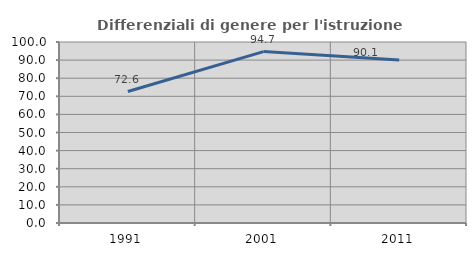
| Category | Differenziali di genere per l'istruzione superiore |
|---|---|
| 1991.0 | 72.618 |
| 2001.0 | 94.713 |
| 2011.0 | 90.112 |